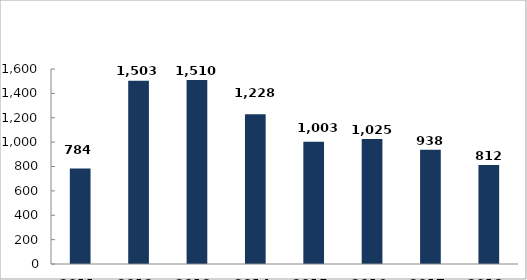
| Category | Series 1 |
|---|---|
| 2011. év | 784 |
| 2012. év | 1503 |
| 2013. év | 1510 |
| 2014. év | 1228 |
| 2015. év | 1003 |
| 2016. év | 1025 |
| 2017. év | 938 |
| 2018. év | 812 |